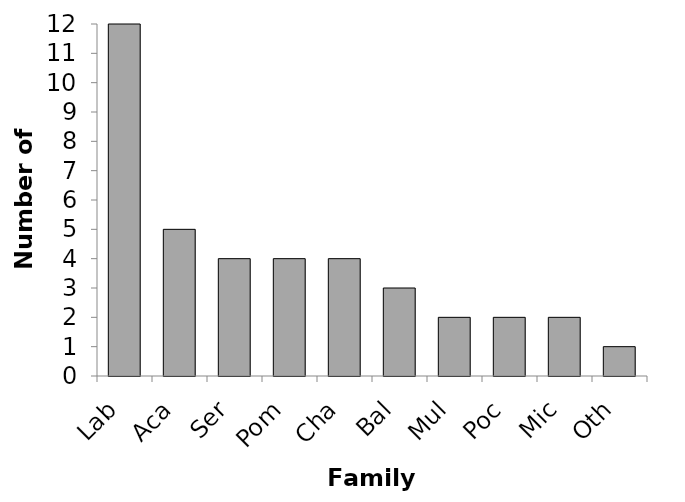
| Category | Series 0 |
|---|---|
| Lab | 12 |
| Aca | 5 |
| Ser | 4 |
| Pom | 4 |
| Cha | 4 |
| Bal | 3 |
| Mul | 2 |
| Poc | 2 |
| Mic | 2 |
| Oth | 1 |